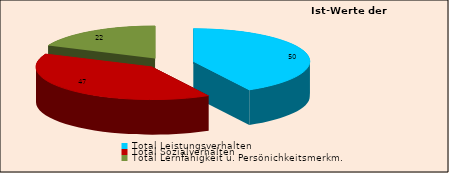
| Category | Series 0 |
|---|---|
| Total Leistungsverhalten | 50 |
| Total Sozialverhalten | 47 |
| Total Lernfähigkeit u. Persönichkeitsmerkm. | 22 |